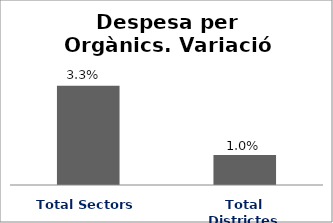
| Category | Series 0 |
|---|---|
| Total Sectors | 0.033 |
| Total Districtes | 0.01 |